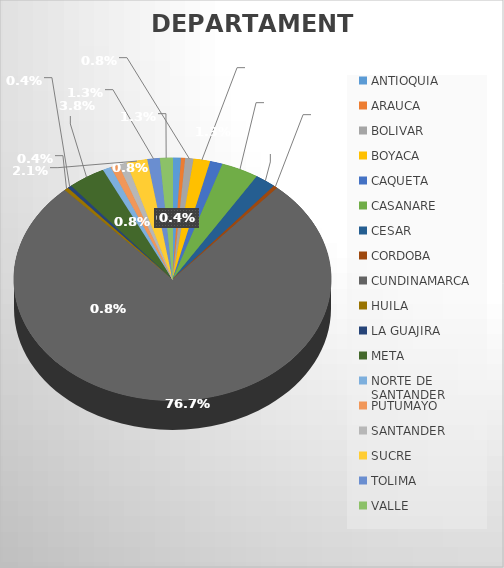
| Category | CANTIDAD |
|---|---|
| ANTIOQUIA | 2 |
| ARAUCA | 1 |
| BOLIVAR | 2 |
| BOYACA | 4 |
| CAQUETA | 3 |
| CASANARE | 9 |
| CESAR | 5 |
| CORDOBA | 1 |
| CUNDINAMARCA | 181 |
| HUILA | 1 |
| LA GUAJIRA | 1 |
| META | 9 |
| NORTE DE SANTANDER | 2 |
| PUTUMAYO | 2 |
| SANTANDER | 2 |
| SUCRE | 5 |
| TOLIMA | 3 |
| VALLE | 3 |